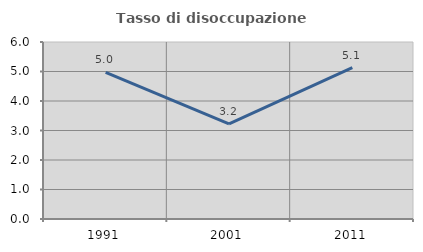
| Category | Tasso di disoccupazione giovanile  |
|---|---|
| 1991.0 | 4.972 |
| 2001.0 | 3.226 |
| 2011.0 | 5.128 |